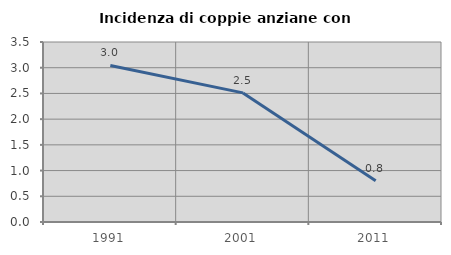
| Category | Incidenza di coppie anziane con figli |
|---|---|
| 1991.0 | 3.043 |
| 2001.0 | 2.51 |
| 2011.0 | 0.803 |